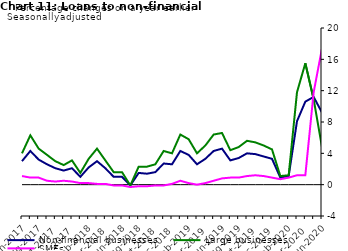
| Category | zero | Non-financial businesses | Large businesses | SMEs |
|---|---|---|---|---|
| Jun-2017 | 0 | 3 | 4 | 1.1 |
| Jul-2017 | 0 | 4.3 | 6.3 | 0.9 |
| Aug-2017 | 0 | 3.2 | 4.6 | 0.9 |
| Sep-2017 | 0 | 2.6 | 3.8 | 0.5 |
| Oct-2017 | 0 | 2.1 | 3 | 0.4 |
| Nov-2017 | 0 | 1.8 | 2.5 | 0.5 |
| Dec-2017 | 0 | 2.1 | 3.1 | 0.4 |
| Jan-2018 | 0 | 1 | 1.5 | 0.2 |
| Feb-2018 | 0 | 2.2 | 3.3 | 0.2 |
| Mar-2018 | 0 | 3 | 4.6 | 0.1 |
| Apr-2018 | 0 | 2.1 | 3.1 | 0.1 |
| May-2018 | 0 | 1 | 1.6 | -0.1 |
| Jun-2018 | 0 | 1 | 1.6 | -0.1 |
| Jul-2018 | 0 | -0.1 | -0.1 | -0.3 |
| Aug-2018 | 0 | 1.5 | 2.3 | -0.2 |
| Sep-2018 | 0 | 1.4 | 2.3 | -0.2 |
| Oct-2018 | 0 | 1.6 | 2.6 | -0.1 |
| Nov-2018 | 0 | 2.7 | 4.3 | -0.1 |
| Dec-2018 | 0 | 2.6 | 4 | 0.1 |
| Jan-2019 | 0 | 4.3 | 6.4 | 0.5 |
| Feb-2019 | 0 | 3.8 | 5.8 | 0.2 |
| Mar-2019 | 0 | 2.6 | 4 | 0 |
| Apr-2019 | 0 | 3.3 | 5 | 0.2 |
| May-2019 | 0 | 4.3 | 6.4 | 0.5 |
| Jun-2019 | 0 | 4.6 | 6.6 | 0.8 |
| Jul-2019 | 0 | 3.1 | 4.4 | 0.9 |
| Aug-2019 | 0 | 3.4 | 4.8 | 0.9 |
| Sep-2019 | 0 | 4 | 5.6 | 1.1 |
| Oct-2019 | 0 | 3.9 | 5.4 | 1.2 |
| Nov-2019 | 0 | 3.6 | 5 | 1.1 |
| Dec-2019 | 0 | 3.3 | 4.5 | 0.9 |
| Jan-2020 | 0 | 0.9 | 1.1 | 0.7 |
| Feb-2020 | 0 | 1.1 | 1.2 | 0.9 |
| Mar-2020 | 0 | 8.1 | 11.8 | 1.2 |
| Apr-2020 | 0 | 10.6 | 15.5 | 1.2 |
| May-2020 | 0 | 11.2 | 10.9 | 11.8 |
| Jun-2020 | 0 | 9.2 | 4.8 | 17.4 |